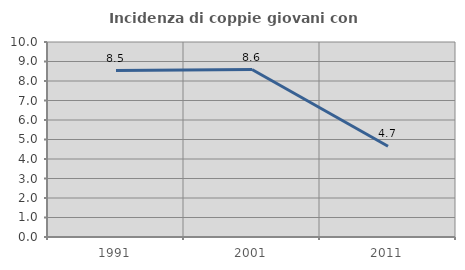
| Category | Incidenza di coppie giovani con figli |
|---|---|
| 1991.0 | 8.537 |
| 2001.0 | 8.589 |
| 2011.0 | 4.651 |